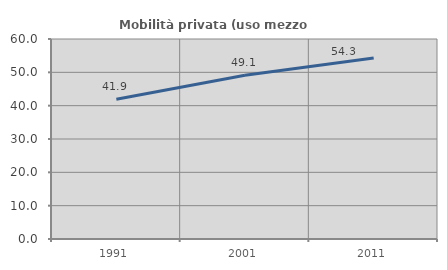
| Category | Mobilità privata (uso mezzo privato) |
|---|---|
| 1991.0 | 41.939 |
| 2001.0 | 49.121 |
| 2011.0 | 54.28 |